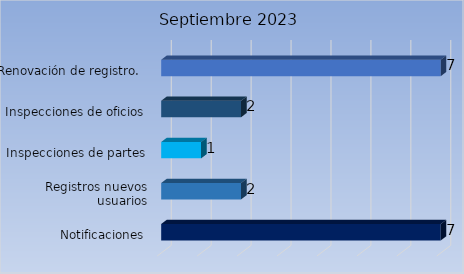
| Category | Cantidad |
|---|---|
| Notificaciones | 7 |
| Registros nuevos usuarios | 2 |
| Inspecciones de partes | 1 |
| Inspecciones de oficios | 2 |
| Renovación de registro.  | 7 |